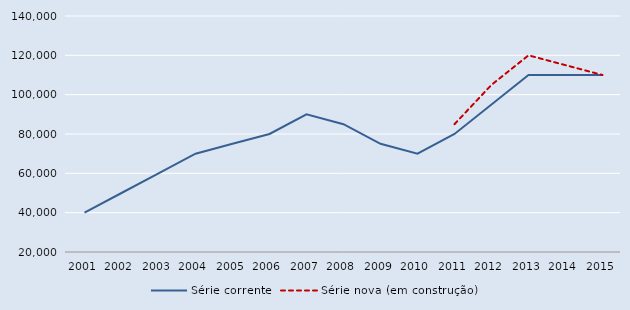
| Category | Série corrente | Série nova (em construção) |
|---|---|---|
| 2001.0 | 40000 | 0 |
| 2002.0 | 50000 | 0 |
| 2003.0 | 60000 | 0 |
| 2004.0 | 70000 | 0 |
| 2005.0 | 75000 | 0 |
| 2006.0 | 80000 | 0 |
| 2007.0 | 90000 | 0 |
| 2008.0 | 85000 | 0 |
| 2009.0 | 75000 | 0 |
| 2010.0 | 70000 | 0 |
| 2011.0 | 80000 | 85000 |
| 2012.0 | 95000 | 105000 |
| 2013.0 | 110000 | 120000 |
| 2014.0 | 110000 | 115000 |
| 2015.0 | 110000 | 110000 |